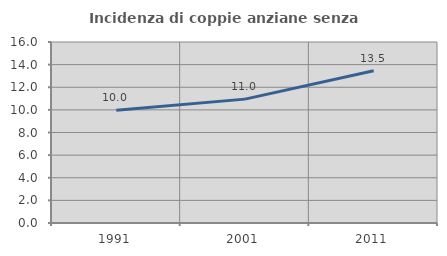
| Category | Incidenza di coppie anziane senza figli  |
|---|---|
| 1991.0 | 9.964 |
| 2001.0 | 10.951 |
| 2011.0 | 13.464 |